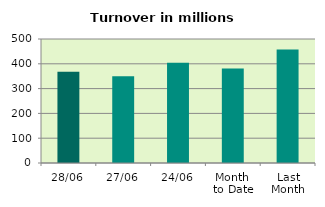
| Category | Series 0 |
|---|---|
| 28/06 | 367.553 |
| 27/06 | 350.135 |
| 24/06 | 404.388 |
| Month 
to Date | 381.276 |
| Last
Month | 457.674 |